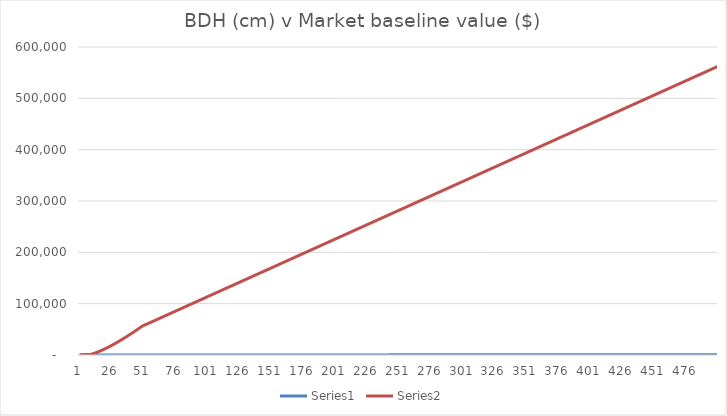
| Category | Series 0 | Series 1 |
|---|---|---|
| 0 | 1 | 132.051 |
| 1 | 2 | 264.102 |
| 2 | 3 | 396.153 |
| 3 | 4 | 528.203 |
| 4 | 5 | 660.254 |
| 5 | 6 | 792.305 |
| 6 | 7 | 924.356 |
| 7 | 8 | 1056.407 |
| 8 | 9 | 1188.458 |
| 9 | 10 | 1320.508 |
| 10 | 11 | 2084.105 |
| 11 | 12 | 2905.115 |
| 12 | 13 | 3778.754 |
| 13 | 14 | 4700.973 |
| 14 | 15 | 5668.303 |
| 15 | 16 | 6677.735 |
| 16 | 17 | 7726.639 |
| 17 | 18 | 8812.693 |
| 18 | 19 | 9933.833 |
| 19 | 20 | 11088.212 |
| 20 | 21 | 12274.169 |
| 21 | 22 | 13490.199 |
| 22 | 23 | 14734.936 |
| 23 | 24 | 16007.131 |
| 24 | 25 | 17305.64 |
| 25 | 26 | 18629.412 |
| 26 | 27 | 19977.473 |
| 27 | 28 | 21348.926 |
| 28 | 29 | 22742.933 |
| 29 | 30 | 24158.718 |
| 30 | 31 | 25595.554 |
| 31 | 32 | 27052.763 |
| 32 | 33 | 28529.708 |
| 33 | 34 | 30025.79 |
| 34 | 35 | 31540.447 |
| 35 | 36 | 33073.149 |
| 36 | 37 | 34623.393 |
| 37 | 38 | 36190.706 |
| 38 | 39 | 37774.639 |
| 39 | 40 | 39374.765 |
| 40 | 41 | 40990.68 |
| 41 | 42 | 42621.999 |
| 42 | 43 | 44268.354 |
| 43 | 44 | 45929.397 |
| 44 | 45 | 47604.792 |
| 45 | 46 | 49294.222 |
| 46 | 47 | 50997.382 |
| 47 | 48 | 52713.978 |
| 48 | 49 | 54443.732 |
| 49 | 50 | 56186.374 |
| 50 | 51 | 57310.102 |
| 51 | 52 | 58433.829 |
| 52 | 53 | 59557.557 |
| 53 | 54 | 60681.284 |
| 54 | 55 | 61805.012 |
| 55 | 56 | 62928.739 |
| 56 | 57 | 64052.467 |
| 57 | 58 | 65176.194 |
| 58 | 59 | 66299.922 |
| 59 | 60 | 67423.649 |
| 60 | 61 | 68547.377 |
| 61 | 62 | 69671.104 |
| 62 | 63 | 70794.832 |
| 63 | 64 | 71918.559 |
| 64 | 65 | 73042.287 |
| 65 | 66 | 74166.014 |
| 66 | 67 | 75289.742 |
| 67 | 68 | 76413.469 |
| 68 | 69 | 77537.197 |
| 69 | 70 | 78660.924 |
| 70 | 71 | 79784.651 |
| 71 | 72 | 80908.379 |
| 72 | 73 | 82032.106 |
| 73 | 74 | 83155.834 |
| 74 | 75 | 84279.561 |
| 75 | 76 | 85403.289 |
| 76 | 77 | 86527.016 |
| 77 | 78 | 87650.744 |
| 78 | 79 | 88774.471 |
| 79 | 80 | 89898.199 |
| 80 | 81 | 91021.926 |
| 81 | 82 | 92145.654 |
| 82 | 83 | 93269.381 |
| 83 | 84 | 94393.109 |
| 84 | 85 | 95516.836 |
| 85 | 86 | 96640.564 |
| 86 | 87 | 97764.291 |
| 87 | 88 | 98888.019 |
| 88 | 89 | 100011.746 |
| 89 | 90 | 101135.474 |
| 90 | 91 | 102259.201 |
| 91 | 92 | 103382.929 |
| 92 | 93 | 104506.656 |
| 93 | 94 | 105630.384 |
| 94 | 95 | 106754.111 |
| 95 | 96 | 107877.839 |
| 96 | 97 | 109001.566 |
| 97 | 98 | 110125.294 |
| 98 | 99 | 111249.021 |
| 99 | 100 | 112372.749 |
| 100 | 101 | 113496.476 |
| 101 | 102 | 114620.204 |
| 102 | 103 | 115743.931 |
| 103 | 104 | 116867.659 |
| 104 | 105 | 117991.386 |
| 105 | 106 | 119115.113 |
| 106 | 107 | 120238.841 |
| 107 | 108 | 121362.568 |
| 108 | 109 | 122486.296 |
| 109 | 110 | 123610.023 |
| 110 | 111 | 124733.751 |
| 111 | 112 | 125857.478 |
| 112 | 113 | 126981.206 |
| 113 | 114 | 128104.933 |
| 114 | 115 | 129228.661 |
| 115 | 116 | 130352.388 |
| 116 | 117 | 131476.116 |
| 117 | 118 | 132599.843 |
| 118 | 119 | 133723.571 |
| 119 | 120 | 134847.298 |
| 120 | 121 | 135971.026 |
| 121 | 122 | 137094.753 |
| 122 | 123 | 138218.481 |
| 123 | 124 | 139342.208 |
| 124 | 125 | 140465.936 |
| 125 | 126 | 141589.663 |
| 126 | 127 | 142713.391 |
| 127 | 128 | 143837.118 |
| 128 | 129 | 144960.846 |
| 129 | 130 | 146084.573 |
| 130 | 131 | 147208.301 |
| 131 | 132 | 148332.028 |
| 132 | 133 | 149455.756 |
| 133 | 134 | 150579.483 |
| 134 | 135 | 151703.211 |
| 135 | 136 | 152826.938 |
| 136 | 137 | 153950.666 |
| 137 | 138 | 155074.393 |
| 138 | 139 | 156198.121 |
| 139 | 140 | 157321.848 |
| 140 | 141 | 158445.575 |
| 141 | 142 | 159569.303 |
| 142 | 143 | 160693.03 |
| 143 | 144 | 161816.758 |
| 144 | 145 | 162940.485 |
| 145 | 146 | 164064.213 |
| 146 | 147 | 165187.94 |
| 147 | 148 | 166311.668 |
| 148 | 149 | 167435.395 |
| 149 | 150 | 168559.123 |
| 150 | 151 | 169682.85 |
| 151 | 152 | 170806.578 |
| 152 | 153 | 171930.305 |
| 153 | 154 | 173054.033 |
| 154 | 155 | 174177.76 |
| 155 | 156 | 175301.488 |
| 156 | 157 | 176425.215 |
| 157 | 158 | 177548.943 |
| 158 | 159 | 178672.67 |
| 159 | 160 | 179796.398 |
| 160 | 161 | 180920.125 |
| 161 | 162 | 182043.853 |
| 162 | 163 | 183167.58 |
| 163 | 164 | 184291.308 |
| 164 | 165 | 185415.035 |
| 165 | 166 | 186538.763 |
| 166 | 167 | 187662.49 |
| 167 | 168 | 188786.218 |
| 168 | 169 | 189909.945 |
| 169 | 170 | 191033.673 |
| 170 | 171 | 192157.4 |
| 171 | 172 | 193281.128 |
| 172 | 173 | 194404.855 |
| 173 | 174 | 195528.583 |
| 174 | 175 | 196652.31 |
| 175 | 176 | 197776.037 |
| 176 | 177 | 198899.765 |
| 177 | 178 | 200023.492 |
| 178 | 179 | 201147.22 |
| 179 | 180 | 202270.947 |
| 180 | 181 | 203394.675 |
| 181 | 182 | 204518.402 |
| 182 | 183 | 205642.13 |
| 183 | 184 | 206765.857 |
| 184 | 185 | 207889.585 |
| 185 | 186 | 209013.312 |
| 186 | 187 | 210137.04 |
| 187 | 188 | 211260.767 |
| 188 | 189 | 212384.495 |
| 189 | 190 | 213508.222 |
| 190 | 191 | 214631.95 |
| 191 | 192 | 215755.677 |
| 192 | 193 | 216879.405 |
| 193 | 194 | 218003.132 |
| 194 | 195 | 219126.86 |
| 195 | 196 | 220250.587 |
| 196 | 197 | 221374.315 |
| 197 | 198 | 222498.042 |
| 198 | 199 | 223621.77 |
| 199 | 200 | 224745.497 |
| 200 | 201 | 225869.225 |
| 201 | 202 | 226992.952 |
| 202 | 203 | 228116.68 |
| 203 | 204 | 229240.407 |
| 204 | 205 | 230364.135 |
| 205 | 206 | 231487.862 |
| 206 | 207 | 232611.59 |
| 207 | 208 | 233735.317 |
| 208 | 209 | 234859.044 |
| 209 | 210 | 235982.772 |
| 210 | 211 | 237106.499 |
| 211 | 212 | 238230.227 |
| 212 | 213 | 239353.954 |
| 213 | 214 | 240477.682 |
| 214 | 215 | 241601.409 |
| 215 | 216 | 242725.137 |
| 216 | 217 | 243848.864 |
| 217 | 218 | 244972.592 |
| 218 | 219 | 246096.319 |
| 219 | 220 | 247220.047 |
| 220 | 221 | 248343.774 |
| 221 | 222 | 249467.502 |
| 222 | 223 | 250591.229 |
| 223 | 224 | 251714.957 |
| 224 | 225 | 252838.684 |
| 225 | 226 | 253962.412 |
| 226 | 227 | 255086.139 |
| 227 | 228 | 256209.867 |
| 228 | 229 | 257333.594 |
| 229 | 230 | 258457.322 |
| 230 | 231 | 259581.049 |
| 231 | 232 | 260704.777 |
| 232 | 233 | 261828.504 |
| 233 | 234 | 262952.232 |
| 234 | 235 | 264075.959 |
| 235 | 236 | 265199.687 |
| 236 | 237 | 266323.414 |
| 237 | 238 | 267447.142 |
| 238 | 239 | 268570.869 |
| 239 | 240 | 269694.597 |
| 240 | 241 | 270818.324 |
| 241 | 242 | 271942.052 |
| 242 | 243 | 273065.779 |
| 243 | 244 | 274189.506 |
| 244 | 245 | 275313.234 |
| 245 | 246 | 276436.961 |
| 246 | 247 | 277560.689 |
| 247 | 248 | 278684.416 |
| 248 | 249 | 279808.144 |
| 249 | 250 | 280931.871 |
| 250 | 251 | 282055.599 |
| 251 | 252 | 283179.326 |
| 252 | 253 | 284303.054 |
| 253 | 254 | 285426.781 |
| 254 | 255 | 286550.509 |
| 255 | 256 | 287674.236 |
| 256 | 257 | 288797.964 |
| 257 | 258 | 289921.691 |
| 258 | 259 | 291045.419 |
| 259 | 260 | 292169.146 |
| 260 | 261 | 293292.874 |
| 261 | 262 | 294416.601 |
| 262 | 263 | 295540.329 |
| 263 | 264 | 296664.056 |
| 264 | 265 | 297787.784 |
| 265 | 266 | 298911.511 |
| 266 | 267 | 300035.239 |
| 267 | 268 | 301158.966 |
| 268 | 269 | 302282.694 |
| 269 | 270 | 303406.421 |
| 270 | 271 | 304530.149 |
| 271 | 272 | 305653.876 |
| 272 | 273 | 306777.604 |
| 273 | 274 | 307901.331 |
| 274 | 275 | 309025.059 |
| 275 | 276 | 310148.786 |
| 276 | 277 | 311272.514 |
| 277 | 278 | 312396.241 |
| 278 | 279 | 313519.968 |
| 279 | 280 | 314643.696 |
| 280 | 281 | 315767.423 |
| 281 | 282 | 316891.151 |
| 282 | 283 | 318014.878 |
| 283 | 284 | 319138.606 |
| 284 | 285 | 320262.333 |
| 285 | 286 | 321386.061 |
| 286 | 287 | 322509.788 |
| 287 | 288 | 323633.516 |
| 288 | 289 | 324757.243 |
| 289 | 290 | 325880.971 |
| 290 | 291 | 327004.698 |
| 291 | 292 | 328128.426 |
| 292 | 293 | 329252.153 |
| 293 | 294 | 330375.881 |
| 294 | 295 | 331499.608 |
| 295 | 296 | 332623.336 |
| 296 | 297 | 333747.063 |
| 297 | 298 | 334870.791 |
| 298 | 299 | 335994.518 |
| 299 | 300 | 337118.246 |
| 300 | 301 | 338241.973 |
| 301 | 302 | 339365.701 |
| 302 | 303 | 340489.428 |
| 303 | 304 | 341613.156 |
| 304 | 305 | 342736.883 |
| 305 | 306 | 343860.611 |
| 306 | 307 | 344984.338 |
| 307 | 308 | 346108.066 |
| 308 | 309 | 347231.793 |
| 309 | 310 | 348355.521 |
| 310 | 311 | 349479.248 |
| 311 | 312 | 350602.976 |
| 312 | 313 | 351726.703 |
| 313 | 314 | 352850.43 |
| 314 | 315 | 353974.158 |
| 315 | 316 | 355097.885 |
| 316 | 317 | 356221.613 |
| 317 | 318 | 357345.34 |
| 318 | 319 | 358469.068 |
| 319 | 320 | 359592.795 |
| 320 | 321 | 360716.523 |
| 321 | 322 | 361840.25 |
| 322 | 323 | 362963.978 |
| 323 | 324 | 364087.705 |
| 324 | 325 | 365211.433 |
| 325 | 326 | 366335.16 |
| 326 | 327 | 367458.888 |
| 327 | 328 | 368582.615 |
| 328 | 329 | 369706.343 |
| 329 | 330 | 370830.07 |
| 330 | 331 | 371953.798 |
| 331 | 332 | 373077.525 |
| 332 | 333 | 374201.253 |
| 333 | 334 | 375324.98 |
| 334 | 335 | 376448.708 |
| 335 | 336 | 377572.435 |
| 336 | 337 | 378696.163 |
| 337 | 338 | 379819.89 |
| 338 | 339 | 380943.618 |
| 339 | 340 | 382067.345 |
| 340 | 341 | 383191.073 |
| 341 | 342 | 384314.8 |
| 342 | 343 | 385438.528 |
| 343 | 344 | 386562.255 |
| 344 | 345 | 387685.983 |
| 345 | 346 | 388809.71 |
| 346 | 347 | 389933.438 |
| 347 | 348 | 391057.165 |
| 348 | 349 | 392180.892 |
| 349 | 350 | 393304.62 |
| 350 | 351 | 394428.347 |
| 351 | 352 | 395552.075 |
| 352 | 353 | 396675.802 |
| 353 | 354 | 397799.53 |
| 354 | 355 | 398923.257 |
| 355 | 356 | 400046.985 |
| 356 | 357 | 401170.712 |
| 357 | 358 | 402294.44 |
| 358 | 359 | 403418.167 |
| 359 | 360 | 404541.895 |
| 360 | 361 | 405665.622 |
| 361 | 362 | 406789.35 |
| 362 | 363 | 407913.077 |
| 363 | 364 | 409036.805 |
| 364 | 365 | 410160.532 |
| 365 | 366 | 411284.26 |
| 366 | 367 | 412407.987 |
| 367 | 368 | 413531.715 |
| 368 | 369 | 414655.442 |
| 369 | 370 | 415779.17 |
| 370 | 371 | 416902.897 |
| 371 | 372 | 418026.625 |
| 372 | 373 | 419150.352 |
| 373 | 374 | 420274.08 |
| 374 | 375 | 421397.807 |
| 375 | 376 | 422521.535 |
| 376 | 377 | 423645.262 |
| 377 | 378 | 424768.99 |
| 378 | 379 | 425892.717 |
| 379 | 380 | 427016.445 |
| 380 | 381 | 428140.172 |
| 381 | 382 | 429263.9 |
| 382 | 383 | 430387.627 |
| 383 | 384 | 431511.354 |
| 384 | 385 | 432635.082 |
| 385 | 386 | 433758.809 |
| 386 | 387 | 434882.537 |
| 387 | 388 | 436006.264 |
| 388 | 389 | 437129.992 |
| 389 | 390 | 438253.719 |
| 390 | 391 | 439377.447 |
| 391 | 392 | 440501.174 |
| 392 | 393 | 441624.902 |
| 393 | 394 | 442748.629 |
| 394 | 395 | 443872.357 |
| 395 | 396 | 444996.084 |
| 396 | 397 | 446119.812 |
| 397 | 398 | 447243.539 |
| 398 | 399 | 448367.267 |
| 399 | 400 | 449490.994 |
| 400 | 401 | 450614.722 |
| 401 | 402 | 451738.449 |
| 402 | 403 | 452862.177 |
| 403 | 404 | 453985.904 |
| 404 | 405 | 455109.632 |
| 405 | 406 | 456233.359 |
| 406 | 407 | 457357.087 |
| 407 | 408 | 458480.814 |
| 408 | 409 | 459604.542 |
| 409 | 410 | 460728.269 |
| 410 | 411 | 461851.997 |
| 411 | 412 | 462975.724 |
| 412 | 413 | 464099.452 |
| 413 | 414 | 465223.179 |
| 414 | 415 | 466346.907 |
| 415 | 416 | 467470.634 |
| 416 | 417 | 468594.362 |
| 417 | 418 | 469718.089 |
| 418 | 419 | 470841.816 |
| 419 | 420 | 471965.544 |
| 420 | 421 | 473089.271 |
| 421 | 422 | 474212.999 |
| 422 | 423 | 475336.726 |
| 423 | 424 | 476460.454 |
| 424 | 425 | 477584.181 |
| 425 | 426 | 478707.909 |
| 426 | 427 | 479831.636 |
| 427 | 428 | 480955.364 |
| 428 | 429 | 482079.091 |
| 429 | 430 | 483202.819 |
| 430 | 431 | 484326.546 |
| 431 | 432 | 485450.274 |
| 432 | 433 | 486574.001 |
| 433 | 434 | 487697.729 |
| 434 | 435 | 488821.456 |
| 435 | 436 | 489945.184 |
| 436 | 437 | 491068.911 |
| 437 | 438 | 492192.639 |
| 438 | 439 | 493316.366 |
| 439 | 440 | 494440.094 |
| 440 | 441 | 495563.821 |
| 441 | 442 | 496687.549 |
| 442 | 443 | 497811.276 |
| 443 | 444 | 498935.004 |
| 444 | 445 | 500058.731 |
| 445 | 446 | 501182.459 |
| 446 | 447 | 502306.186 |
| 447 | 448 | 503429.914 |
| 448 | 449 | 504553.641 |
| 449 | 450 | 505677.369 |
| 450 | 451 | 506801.096 |
| 451 | 452 | 507924.824 |
| 452 | 453 | 509048.551 |
| 453 | 454 | 510172.278 |
| 454 | 455 | 511296.006 |
| 455 | 456 | 512419.733 |
| 456 | 457 | 513543.461 |
| 457 | 458 | 514667.188 |
| 458 | 459 | 515790.916 |
| 459 | 460 | 516914.643 |
| 460 | 461 | 518038.371 |
| 461 | 462 | 519162.098 |
| 462 | 463 | 520285.826 |
| 463 | 464 | 521409.553 |
| 464 | 465 | 522533.281 |
| 465 | 466 | 523657.008 |
| 466 | 467 | 524780.736 |
| 467 | 468 | 525904.463 |
| 468 | 469 | 527028.191 |
| 469 | 470 | 528151.918 |
| 470 | 471 | 529275.646 |
| 471 | 472 | 530399.373 |
| 472 | 473 | 531523.101 |
| 473 | 474 | 532646.828 |
| 474 | 475 | 533770.556 |
| 475 | 476 | 534894.283 |
| 476 | 477 | 536018.011 |
| 477 | 478 | 537141.738 |
| 478 | 479 | 538265.466 |
| 479 | 480 | 539389.193 |
| 480 | 481 | 540512.921 |
| 481 | 482 | 541636.648 |
| 482 | 483 | 542760.376 |
| 483 | 484 | 543884.103 |
| 484 | 485 | 545007.831 |
| 485 | 486 | 546131.558 |
| 486 | 487 | 547255.286 |
| 487 | 488 | 548379.013 |
| 488 | 489 | 549502.74 |
| 489 | 490 | 550626.468 |
| 490 | 491 | 551750.195 |
| 491 | 492 | 552873.923 |
| 492 | 493 | 553997.65 |
| 493 | 494 | 555121.378 |
| 494 | 495 | 556245.105 |
| 495 | 496 | 557368.833 |
| 496 | 497 | 558492.56 |
| 497 | 498 | 559616.288 |
| 498 | 499 | 560740.015 |
| 499 | 500 | 561863.743 |